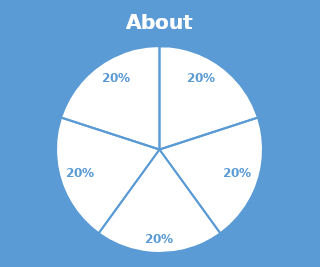
| Category | Series 0 |
|---|---|
|  | 0.2 |
|  | 0.2 |
|  | 0.2 |
|  | 0.2 |
|  | 0.2 |